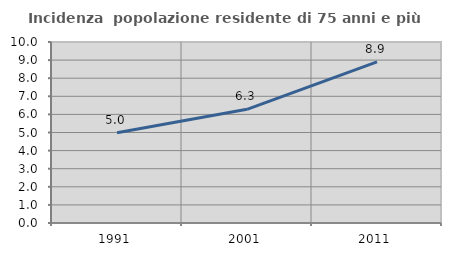
| Category | Incidenza  popolazione residente di 75 anni e più |
|---|---|
| 1991.0 | 4.986 |
| 2001.0 | 6.282 |
| 2011.0 | 8.904 |